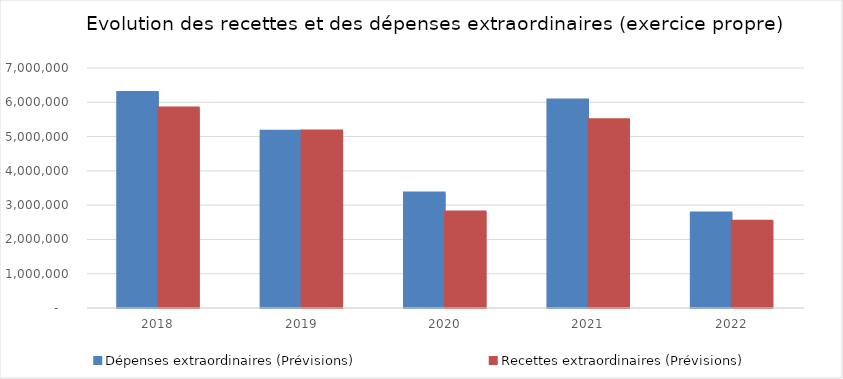
| Category | Dépenses extraordinaires (Prévisions) | Recettes extraordinaires (Prévisions) |
|---|---|---|
| 2018.0 | 6288101 | 5832369.75 |
| 2019.0 | 5157681 | 5160338.75 |
| 2020.0 | 3352283.56 | 2802344.71 |
| 2021.0 | 6065801.77 | 5493035.88 |
| 2022.0 | 2769609.14 | 2529701.6 |